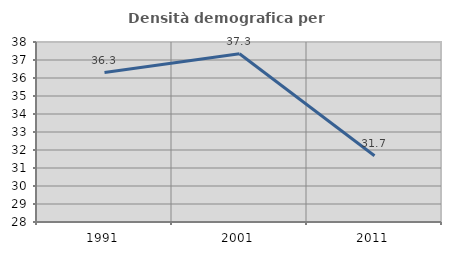
| Category | Densità demografica |
|---|---|
| 1991.0 | 36.301 |
| 2001.0 | 37.348 |
| 2011.0 | 31.682 |